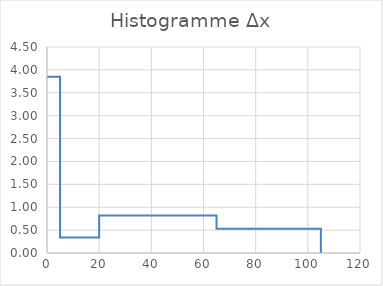
| Category | Histogramme |
|---|---|
| 0.0 | 3.847 |
| 5.0 | 3.847 |
| 5.0 | 0.341 |
| 20.0 | 0.341 |
| 20.0 | 0.822 |
| 65.0 | 0.822 |
| 65.0 | 0.529 |
| 105.0 | 0.529 |
| 105.0 | 0.529 |
| 105.0 | 0 |